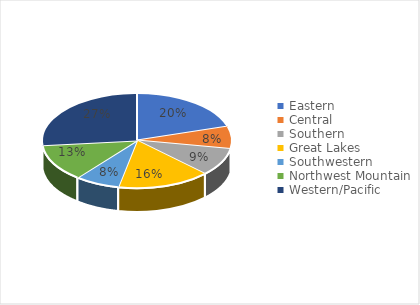
| Category | Series 0 |
|---|---|
| Eastern | 32 |
| Central | 12 |
| Southern | 15 |
| Great Lakes | 25 |
| Southwestern | 12 |
| Northwest Mountain | 20 |
| Western/Pacific | 42 |